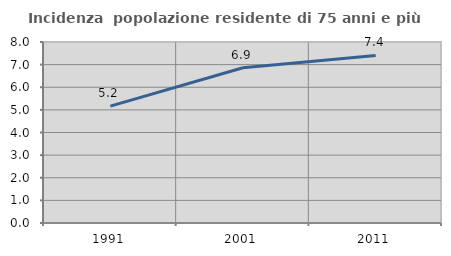
| Category | Incidenza  popolazione residente di 75 anni e più |
|---|---|
| 1991.0 | 5.166 |
| 2001.0 | 6.863 |
| 2011.0 | 7.405 |